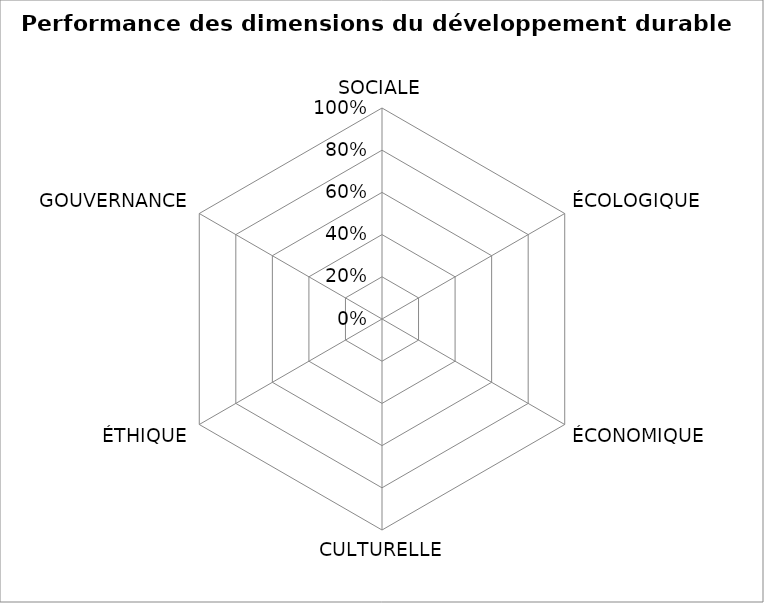
| Category | Performance moyenne |
|---|---|
| SOCIALE | 0 |
| ÉCOLOGIQUE | 0 |
| ÉCONOMIQUE | 0 |
| CULTURELLE | 0 |
| ÉTHIQUE | 0 |
| GOUVERNANCE | 0 |